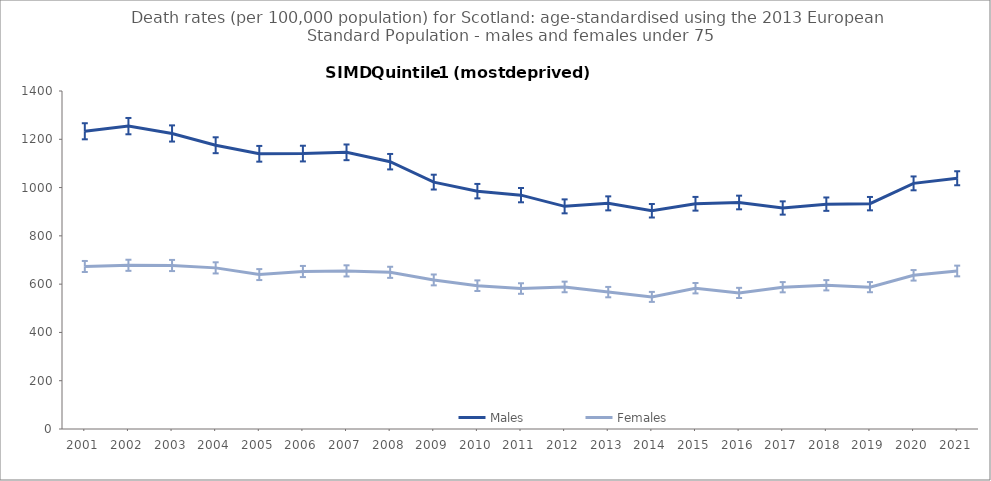
| Category | Males | Females |
|---|---|---|
| 2001.0 | 1233.2 | 673.2 |
| 2002.0 | 1254.5 | 678.1 |
| 2003.0 | 1224.1 | 677.2 |
| 2004.0 | 1175.4 | 667.4 |
| 2005.0 | 1139.9 | 639.6 |
| 2006.0 | 1140.8 | 652.3 |
| 2007.0 | 1146 | 654.9 |
| 2008.0 | 1107.2 | 649 |
| 2009.0 | 1022.6 | 617.5 |
| 2010.0 | 985.2 | 593.6 |
| 2011.0 | 968.6 | 581.8 |
| 2012.0 | 922.2 | 588.4 |
| 2013.0 | 934.6 | 567 |
| 2014.0 | 904 | 547.2 |
| 2015.0 | 932.9 | 583.2 |
| 2016.0 | 938.2 | 563.7 |
| 2017.0 | 915.4 | 587.3 |
| 2018.0 | 931.3 | 595.4 |
| 2019.0 | 933.4 | 587.6 |
| 2020.0 | 1017.4 | 636.5 |
| 2021.0 | 1038.6 | 654.5 |